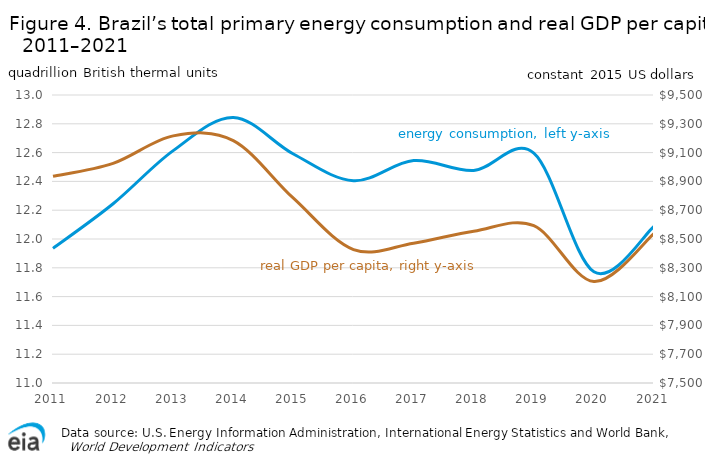
| Category | energy consumption (quad Btu) |
|---|---|
| 2011.0 | 11.935 |
| 2012.0 | 12.245 |
| 2013.0 | 12.614 |
| 2014.0 | 12.844 |
| 2015.0 | 12.59 |
| 2016.0 | 12.405 |
| 2017.0 | 12.545 |
| 2018.0 | 12.476 |
| 2019.0 | 12.597 |
| 2020.0 | 11.772 |
| 2021.0 | 12.087 |